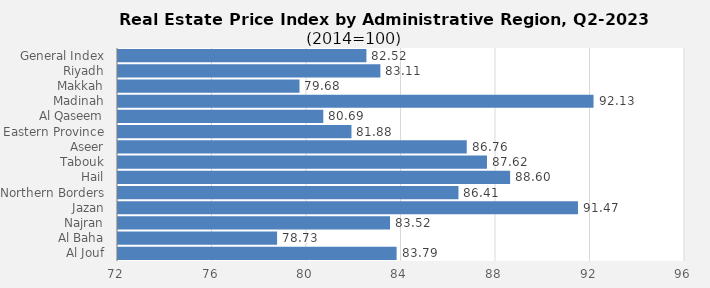
| Category | 2023 |
|---|---|
| General Index | 82.516 |
| Riyadh | 83.106 |
| Makkah | 79.682 |
| Madinah | 92.128 |
| Al Qaseem | 80.69 |
| Eastern Province | 81.882 |
| Aseer | 86.762 |
| Tabouk | 87.618 |
| Hail | 88.598 |
| Northern Borders | 86.411 |
| Jazan | 91.469 |
| Najran | 83.515 |
| Al Baha | 78.734 |
| Al Jouf | 83.793 |